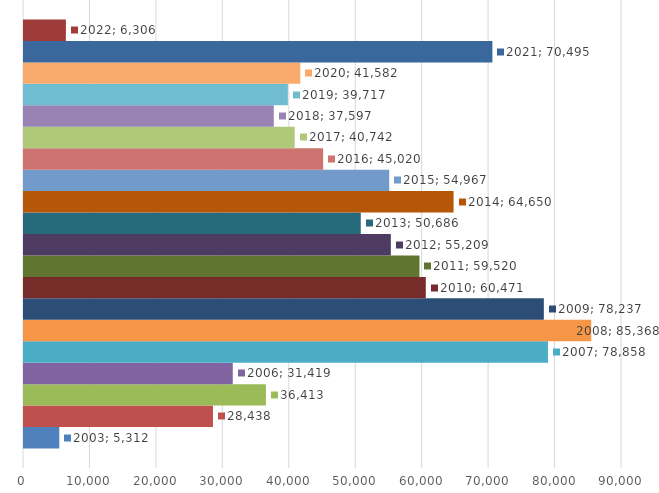
| Category | 2003 | 2004 | 2005 | 2006 | 2007 | 2008 | 2009 | 2010 | 2011 | 2012 | 2013 | 2014 | 2015 | 2016 | 2017 | 2018 | 2019 | 2020 | 2021 | 2022 |
|---|---|---|---|---|---|---|---|---|---|---|---|---|---|---|---|---|---|---|---|---|
| 0 | 5312 | 28438 | 36413 | 31419 | 78858 | 85368 | 78237 | 60471 | 59520 | 55209 | 50686 | 64650 | 54967 | 45020 | 40742 | 37597 | 39717 | 41582 | 70495 | 6306 |